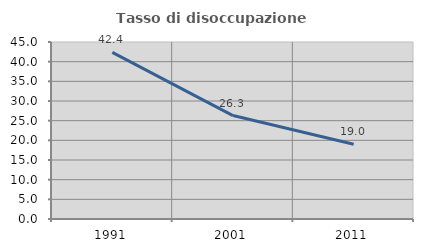
| Category | Tasso di disoccupazione giovanile  |
|---|---|
| 1991.0 | 42.37 |
| 2001.0 | 26.296 |
| 2011.0 | 19.011 |